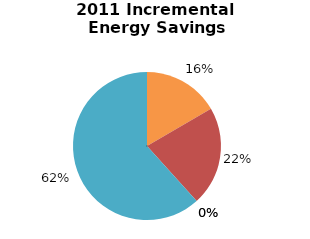
| Category | Incremental Energy Savings (kWh) |
|---|---|
| Consumer Program Total | 81113.01 |
| Business Program Total | 105919.212 |
| Industrial Program Total | 0 |
| Home Assistance Program Total | 0 |
| Pre-2011 Programs completed in 2011 Total | 301303.376 |